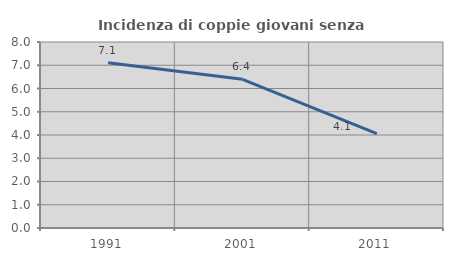
| Category | Incidenza di coppie giovani senza figli |
|---|---|
| 1991.0 | 7.109 |
| 2001.0 | 6.396 |
| 2011.0 | 4.063 |